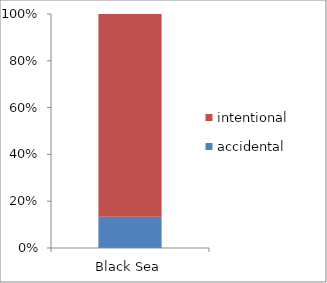
| Category | accidental | intentional |
|---|---|---|
| Black Sea | 3225.5 | 20937.75 |